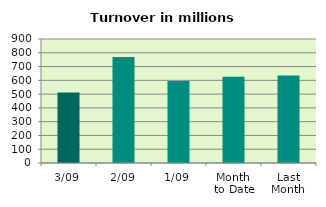
| Category | Series 0 |
|---|---|
| 3/09 | 512.374 |
| 2/09 | 769.582 |
| 1/09 | 595.064 |
| Month 
to Date | 625.673 |
| Last
Month | 635.477 |